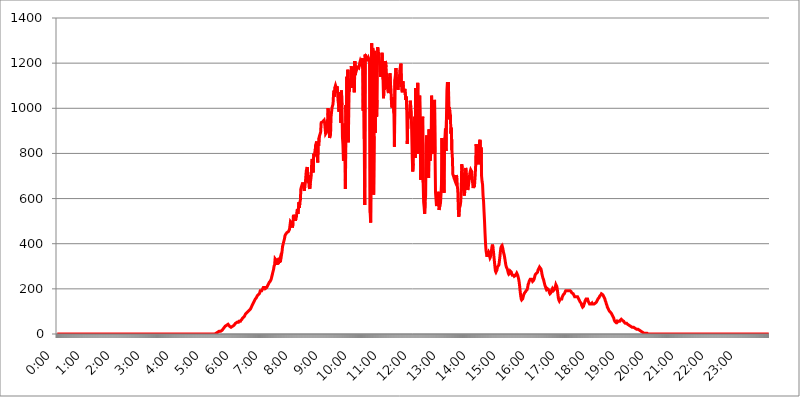
| Category | 2015.05.01. Intenzitás [W/m^2] |
|---|---|
| 0.0 | 0 |
| 0.0006944444444444445 | 0 |
| 0.001388888888888889 | 0 |
| 0.0020833333333333333 | 0 |
| 0.002777777777777778 | 0 |
| 0.003472222222222222 | 0 |
| 0.004166666666666667 | 0 |
| 0.004861111111111111 | 0 |
| 0.005555555555555556 | 0 |
| 0.0062499999999999995 | 0 |
| 0.006944444444444444 | 0 |
| 0.007638888888888889 | 0 |
| 0.008333333333333333 | 0 |
| 0.009027777777777779 | 0 |
| 0.009722222222222222 | 0 |
| 0.010416666666666666 | 0 |
| 0.011111111111111112 | 0 |
| 0.011805555555555555 | 0 |
| 0.012499999999999999 | 0 |
| 0.013194444444444444 | 0 |
| 0.013888888888888888 | 0 |
| 0.014583333333333332 | 0 |
| 0.015277777777777777 | 0 |
| 0.015972222222222224 | 0 |
| 0.016666666666666666 | 0 |
| 0.017361111111111112 | 0 |
| 0.018055555555555557 | 0 |
| 0.01875 | 0 |
| 0.019444444444444445 | 0 |
| 0.02013888888888889 | 0 |
| 0.020833333333333332 | 0 |
| 0.02152777777777778 | 0 |
| 0.022222222222222223 | 0 |
| 0.02291666666666667 | 0 |
| 0.02361111111111111 | 0 |
| 0.024305555555555556 | 0 |
| 0.024999999999999998 | 0 |
| 0.025694444444444447 | 0 |
| 0.02638888888888889 | 0 |
| 0.027083333333333334 | 0 |
| 0.027777777777777776 | 0 |
| 0.02847222222222222 | 0 |
| 0.029166666666666664 | 0 |
| 0.029861111111111113 | 0 |
| 0.030555555555555555 | 0 |
| 0.03125 | 0 |
| 0.03194444444444445 | 0 |
| 0.03263888888888889 | 0 |
| 0.03333333333333333 | 0 |
| 0.034027777777777775 | 0 |
| 0.034722222222222224 | 0 |
| 0.035416666666666666 | 0 |
| 0.036111111111111115 | 0 |
| 0.03680555555555556 | 0 |
| 0.0375 | 0 |
| 0.03819444444444444 | 0 |
| 0.03888888888888889 | 0 |
| 0.03958333333333333 | 0 |
| 0.04027777777777778 | 0 |
| 0.04097222222222222 | 0 |
| 0.041666666666666664 | 0 |
| 0.042361111111111106 | 0 |
| 0.04305555555555556 | 0 |
| 0.043750000000000004 | 0 |
| 0.044444444444444446 | 0 |
| 0.04513888888888889 | 0 |
| 0.04583333333333334 | 0 |
| 0.04652777777777778 | 0 |
| 0.04722222222222222 | 0 |
| 0.04791666666666666 | 0 |
| 0.04861111111111111 | 0 |
| 0.049305555555555554 | 0 |
| 0.049999999999999996 | 0 |
| 0.05069444444444445 | 0 |
| 0.051388888888888894 | 0 |
| 0.052083333333333336 | 0 |
| 0.05277777777777778 | 0 |
| 0.05347222222222222 | 0 |
| 0.05416666666666667 | 0 |
| 0.05486111111111111 | 0 |
| 0.05555555555555555 | 0 |
| 0.05625 | 0 |
| 0.05694444444444444 | 0 |
| 0.057638888888888885 | 0 |
| 0.05833333333333333 | 0 |
| 0.05902777777777778 | 0 |
| 0.059722222222222225 | 0 |
| 0.06041666666666667 | 0 |
| 0.061111111111111116 | 0 |
| 0.06180555555555556 | 0 |
| 0.0625 | 0 |
| 0.06319444444444444 | 0 |
| 0.06388888888888888 | 0 |
| 0.06458333333333334 | 0 |
| 0.06527777777777778 | 0 |
| 0.06597222222222222 | 0 |
| 0.06666666666666667 | 0 |
| 0.06736111111111111 | 0 |
| 0.06805555555555555 | 0 |
| 0.06874999999999999 | 0 |
| 0.06944444444444443 | 0 |
| 0.07013888888888889 | 0 |
| 0.07083333333333333 | 0 |
| 0.07152777777777779 | 0 |
| 0.07222222222222223 | 0 |
| 0.07291666666666667 | 0 |
| 0.07361111111111111 | 0 |
| 0.07430555555555556 | 0 |
| 0.075 | 0 |
| 0.07569444444444444 | 0 |
| 0.0763888888888889 | 0 |
| 0.07708333333333334 | 0 |
| 0.07777777777777778 | 0 |
| 0.07847222222222222 | 0 |
| 0.07916666666666666 | 0 |
| 0.0798611111111111 | 0 |
| 0.08055555555555556 | 0 |
| 0.08125 | 0 |
| 0.08194444444444444 | 0 |
| 0.08263888888888889 | 0 |
| 0.08333333333333333 | 0 |
| 0.08402777777777777 | 0 |
| 0.08472222222222221 | 0 |
| 0.08541666666666665 | 0 |
| 0.08611111111111112 | 0 |
| 0.08680555555555557 | 0 |
| 0.08750000000000001 | 0 |
| 0.08819444444444445 | 0 |
| 0.08888888888888889 | 0 |
| 0.08958333333333333 | 0 |
| 0.09027777777777778 | 0 |
| 0.09097222222222222 | 0 |
| 0.09166666666666667 | 0 |
| 0.09236111111111112 | 0 |
| 0.09305555555555556 | 0 |
| 0.09375 | 0 |
| 0.09444444444444444 | 0 |
| 0.09513888888888888 | 0 |
| 0.09583333333333333 | 0 |
| 0.09652777777777777 | 0 |
| 0.09722222222222222 | 0 |
| 0.09791666666666667 | 0 |
| 0.09861111111111111 | 0 |
| 0.09930555555555555 | 0 |
| 0.09999999999999999 | 0 |
| 0.10069444444444443 | 0 |
| 0.1013888888888889 | 0 |
| 0.10208333333333335 | 0 |
| 0.10277777777777779 | 0 |
| 0.10347222222222223 | 0 |
| 0.10416666666666667 | 0 |
| 0.10486111111111111 | 0 |
| 0.10555555555555556 | 0 |
| 0.10625 | 0 |
| 0.10694444444444444 | 0 |
| 0.1076388888888889 | 0 |
| 0.10833333333333334 | 0 |
| 0.10902777777777778 | 0 |
| 0.10972222222222222 | 0 |
| 0.1111111111111111 | 0 |
| 0.11180555555555556 | 0 |
| 0.11180555555555556 | 0 |
| 0.1125 | 0 |
| 0.11319444444444444 | 0 |
| 0.11388888888888889 | 0 |
| 0.11458333333333333 | 0 |
| 0.11527777777777777 | 0 |
| 0.11597222222222221 | 0 |
| 0.11666666666666665 | 0 |
| 0.1173611111111111 | 0 |
| 0.11805555555555557 | 0 |
| 0.11944444444444445 | 0 |
| 0.12013888888888889 | 0 |
| 0.12083333333333333 | 0 |
| 0.12152777777777778 | 0 |
| 0.12222222222222223 | 0 |
| 0.12291666666666667 | 0 |
| 0.12291666666666667 | 0 |
| 0.12361111111111112 | 0 |
| 0.12430555555555556 | 0 |
| 0.125 | 0 |
| 0.12569444444444444 | 0 |
| 0.12638888888888888 | 0 |
| 0.12708333333333333 | 0 |
| 0.16875 | 0 |
| 0.12847222222222224 | 0 |
| 0.12916666666666668 | 0 |
| 0.12986111111111112 | 0 |
| 0.13055555555555556 | 0 |
| 0.13125 | 0 |
| 0.13194444444444445 | 0 |
| 0.1326388888888889 | 0 |
| 0.13333333333333333 | 0 |
| 0.13402777777777777 | 0 |
| 0.13402777777777777 | 0 |
| 0.13472222222222222 | 0 |
| 0.13541666666666666 | 0 |
| 0.1361111111111111 | 0 |
| 0.13749999999999998 | 0 |
| 0.13819444444444443 | 0 |
| 0.1388888888888889 | 0 |
| 0.13958333333333334 | 0 |
| 0.14027777777777778 | 0 |
| 0.14097222222222222 | 0 |
| 0.14166666666666666 | 0 |
| 0.1423611111111111 | 0 |
| 0.14305555555555557 | 0 |
| 0.14375000000000002 | 0 |
| 0.14444444444444446 | 0 |
| 0.1451388888888889 | 0 |
| 0.1451388888888889 | 0 |
| 0.14652777777777778 | 0 |
| 0.14722222222222223 | 0 |
| 0.14791666666666667 | 0 |
| 0.1486111111111111 | 0 |
| 0.14930555555555555 | 0 |
| 0.15 | 0 |
| 0.15069444444444444 | 0 |
| 0.15138888888888888 | 0 |
| 0.15208333333333332 | 0 |
| 0.15277777777777776 | 0 |
| 0.15347222222222223 | 0 |
| 0.15416666666666667 | 0 |
| 0.15486111111111112 | 0 |
| 0.15555555555555556 | 0 |
| 0.15625 | 0 |
| 0.15694444444444444 | 0 |
| 0.15763888888888888 | 0 |
| 0.15833333333333333 | 0 |
| 0.15902777777777777 | 0 |
| 0.15972222222222224 | 0 |
| 0.16041666666666668 | 0 |
| 0.16111111111111112 | 0 |
| 0.16180555555555556 | 0 |
| 0.1625 | 0 |
| 0.16319444444444445 | 0 |
| 0.1638888888888889 | 0 |
| 0.16458333333333333 | 0 |
| 0.16527777777777777 | 0 |
| 0.16597222222222222 | 0 |
| 0.16666666666666666 | 0 |
| 0.1673611111111111 | 0 |
| 0.16805555555555554 | 0 |
| 0.16874999999999998 | 0 |
| 0.16944444444444443 | 0 |
| 0.17013888888888887 | 0 |
| 0.1708333333333333 | 0 |
| 0.17152777777777775 | 0 |
| 0.17222222222222225 | 0 |
| 0.1729166666666667 | 0 |
| 0.17361111111111113 | 0 |
| 0.17430555555555557 | 0 |
| 0.17500000000000002 | 0 |
| 0.17569444444444446 | 0 |
| 0.1763888888888889 | 0 |
| 0.17708333333333334 | 0 |
| 0.17777777777777778 | 0 |
| 0.17847222222222223 | 0 |
| 0.17916666666666667 | 0 |
| 0.1798611111111111 | 0 |
| 0.18055555555555555 | 0 |
| 0.18125 | 0 |
| 0.18194444444444444 | 0 |
| 0.1826388888888889 | 0 |
| 0.18333333333333335 | 0 |
| 0.1840277777777778 | 0 |
| 0.18472222222222223 | 0 |
| 0.18541666666666667 | 0 |
| 0.18611111111111112 | 0 |
| 0.18680555555555556 | 0 |
| 0.1875 | 0 |
| 0.18819444444444444 | 0 |
| 0.18888888888888888 | 0 |
| 0.18958333333333333 | 0 |
| 0.19027777777777777 | 0 |
| 0.1909722222222222 | 0 |
| 0.19166666666666665 | 0 |
| 0.19236111111111112 | 0 |
| 0.19305555555555554 | 0 |
| 0.19375 | 0 |
| 0.19444444444444445 | 0 |
| 0.1951388888888889 | 0 |
| 0.19583333333333333 | 0 |
| 0.19652777777777777 | 0 |
| 0.19722222222222222 | 0 |
| 0.19791666666666666 | 0 |
| 0.1986111111111111 | 0 |
| 0.19930555555555554 | 0 |
| 0.19999999999999998 | 0 |
| 0.20069444444444443 | 0 |
| 0.20138888888888887 | 0 |
| 0.2020833333333333 | 0 |
| 0.2027777777777778 | 0 |
| 0.2034722222222222 | 0 |
| 0.2041666666666667 | 0 |
| 0.20486111111111113 | 0 |
| 0.20555555555555557 | 0 |
| 0.20625000000000002 | 0 |
| 0.20694444444444446 | 0 |
| 0.2076388888888889 | 0 |
| 0.20833333333333334 | 0 |
| 0.20902777777777778 | 0 |
| 0.20972222222222223 | 0 |
| 0.21041666666666667 | 0 |
| 0.2111111111111111 | 0 |
| 0.21180555555555555 | 0 |
| 0.2125 | 0 |
| 0.21319444444444444 | 0 |
| 0.2138888888888889 | 0 |
| 0.21458333333333335 | 0 |
| 0.2152777777777778 | 0 |
| 0.21597222222222223 | 0 |
| 0.21666666666666667 | 0 |
| 0.21736111111111112 | 0 |
| 0.21805555555555556 | 0 |
| 0.21875 | 0 |
| 0.21944444444444444 | 0 |
| 0.22013888888888888 | 0 |
| 0.22083333333333333 | 0 |
| 0.22152777777777777 | 3.525 |
| 0.2222222222222222 | 3.525 |
| 0.22291666666666665 | 3.525 |
| 0.2236111111111111 | 3.525 |
| 0.22430555555555556 | 7.887 |
| 0.225 | 7.887 |
| 0.22569444444444445 | 7.887 |
| 0.2263888888888889 | 7.887 |
| 0.22708333333333333 | 12.257 |
| 0.22777777777777777 | 12.257 |
| 0.22847222222222222 | 12.257 |
| 0.22916666666666666 | 12.257 |
| 0.2298611111111111 | 16.636 |
| 0.23055555555555554 | 16.636 |
| 0.23124999999999998 | 16.636 |
| 0.23194444444444443 | 21.024 |
| 0.23263888888888887 | 21.024 |
| 0.2333333333333333 | 25.419 |
| 0.2340277777777778 | 25.419 |
| 0.2347222222222222 | 29.823 |
| 0.2354166666666667 | 34.234 |
| 0.23611111111111113 | 34.234 |
| 0.23680555555555557 | 38.653 |
| 0.23750000000000002 | 38.653 |
| 0.23819444444444446 | 38.653 |
| 0.2388888888888889 | 38.653 |
| 0.23958333333333334 | 43.079 |
| 0.24027777777777778 | 43.079 |
| 0.24097222222222223 | 38.653 |
| 0.24166666666666667 | 34.234 |
| 0.2423611111111111 | 29.823 |
| 0.24305555555555555 | 29.823 |
| 0.24375 | 29.823 |
| 0.24444444444444446 | 29.823 |
| 0.24513888888888888 | 34.234 |
| 0.24583333333333335 | 34.234 |
| 0.2465277777777778 | 38.653 |
| 0.24722222222222223 | 38.653 |
| 0.24791666666666667 | 38.653 |
| 0.24861111111111112 | 43.079 |
| 0.24930555555555556 | 43.079 |
| 0.25 | 47.511 |
| 0.25069444444444444 | 47.511 |
| 0.2513888888888889 | 47.511 |
| 0.2520833333333333 | 51.951 |
| 0.25277777777777777 | 51.951 |
| 0.2534722222222222 | 51.951 |
| 0.25416666666666665 | 51.951 |
| 0.2548611111111111 | 56.398 |
| 0.2555555555555556 | 56.398 |
| 0.25625000000000003 | 56.398 |
| 0.2569444444444445 | 56.398 |
| 0.2576388888888889 | 60.85 |
| 0.25833333333333336 | 60.85 |
| 0.2590277777777778 | 65.31 |
| 0.25972222222222224 | 69.775 |
| 0.2604166666666667 | 69.775 |
| 0.2611111111111111 | 74.246 |
| 0.26180555555555557 | 74.246 |
| 0.2625 | 78.722 |
| 0.26319444444444445 | 83.205 |
| 0.2638888888888889 | 87.692 |
| 0.26458333333333334 | 87.692 |
| 0.2652777777777778 | 92.184 |
| 0.2659722222222222 | 92.184 |
| 0.26666666666666666 | 96.682 |
| 0.2673611111111111 | 96.682 |
| 0.26805555555555555 | 101.184 |
| 0.26875 | 101.184 |
| 0.26944444444444443 | 105.69 |
| 0.2701388888888889 | 105.69 |
| 0.2708333333333333 | 110.201 |
| 0.27152777777777776 | 114.716 |
| 0.2722222222222222 | 119.235 |
| 0.27291666666666664 | 123.758 |
| 0.2736111111111111 | 128.284 |
| 0.2743055555555555 | 132.814 |
| 0.27499999999999997 | 137.347 |
| 0.27569444444444446 | 141.884 |
| 0.27638888888888885 | 146.423 |
| 0.27708333333333335 | 146.423 |
| 0.2777777777777778 | 155.509 |
| 0.27847222222222223 | 155.509 |
| 0.2791666666666667 | 160.056 |
| 0.2798611111111111 | 164.605 |
| 0.28055555555555556 | 169.156 |
| 0.28125 | 169.156 |
| 0.28194444444444444 | 173.709 |
| 0.2826388888888889 | 173.709 |
| 0.2833333333333333 | 178.264 |
| 0.28402777777777777 | 182.82 |
| 0.2847222222222222 | 191.937 |
| 0.28541666666666665 | 191.937 |
| 0.28611111111111115 | 191.937 |
| 0.28680555555555554 | 191.937 |
| 0.28750000000000003 | 196.497 |
| 0.2881944444444445 | 201.058 |
| 0.2888888888888889 | 205.62 |
| 0.28958333333333336 | 205.62 |
| 0.2902777777777778 | 205.62 |
| 0.29097222222222224 | 205.62 |
| 0.2916666666666667 | 201.058 |
| 0.2923611111111111 | 201.058 |
| 0.29305555555555557 | 201.058 |
| 0.29375 | 205.62 |
| 0.29444444444444445 | 210.182 |
| 0.2951388888888889 | 214.746 |
| 0.29583333333333334 | 219.309 |
| 0.2965277777777778 | 219.309 |
| 0.2972222222222222 | 228.436 |
| 0.29791666666666666 | 228.436 |
| 0.2986111111111111 | 233 |
| 0.29930555555555555 | 237.564 |
| 0.3 | 242.127 |
| 0.30069444444444443 | 251.251 |
| 0.3013888888888889 | 260.373 |
| 0.3020833333333333 | 269.49 |
| 0.30277777777777776 | 278.603 |
| 0.3034722222222222 | 287.709 |
| 0.30416666666666664 | 301.354 |
| 0.3048611111111111 | 305.898 |
| 0.3055555555555555 | 333.113 |
| 0.30624999999999997 | 333.113 |
| 0.3069444444444444 | 333.113 |
| 0.3076388888888889 | 324.052 |
| 0.30833333333333335 | 305.898 |
| 0.3090277777777778 | 333.113 |
| 0.30972222222222223 | 310.44 |
| 0.3104166666666667 | 319.517 |
| 0.3111111111111111 | 337.639 |
| 0.31180555555555556 | 314.98 |
| 0.3125 | 333.113 |
| 0.31319444444444444 | 342.162 |
| 0.3138888888888889 | 337.639 |
| 0.3145833333333333 | 351.198 |
| 0.31527777777777777 | 364.728 |
| 0.3159722222222222 | 387.202 |
| 0.31666666666666665 | 396.164 |
| 0.31736111111111115 | 405.108 |
| 0.31805555555555554 | 414.035 |
| 0.31875000000000003 | 422.943 |
| 0.3194444444444445 | 436.27 |
| 0.3201388888888889 | 440.702 |
| 0.32083333333333336 | 445.129 |
| 0.3215277777777778 | 445.129 |
| 0.32222222222222224 | 449.551 |
| 0.3229166666666667 | 453.968 |
| 0.3236111111111111 | 449.551 |
| 0.32430555555555557 | 453.968 |
| 0.325 | 458.38 |
| 0.32569444444444445 | 462.786 |
| 0.3263888888888889 | 467.187 |
| 0.32708333333333334 | 497.836 |
| 0.3277777777777778 | 493.475 |
| 0.3284722222222222 | 502.192 |
| 0.32916666666666666 | 489.108 |
| 0.3298611111111111 | 471.582 |
| 0.33055555555555555 | 489.108 |
| 0.33125 | 528.2 |
| 0.33194444444444443 | 510.885 |
| 0.3326388888888889 | 523.88 |
| 0.3333333333333333 | 519.555 |
| 0.3340277777777778 | 502.192 |
| 0.3347222222222222 | 510.885 |
| 0.3354166666666667 | 519.555 |
| 0.3361111111111111 | 541.121 |
| 0.3368055555555556 | 553.986 |
| 0.33749999999999997 | 532.513 |
| 0.33819444444444446 | 553.986 |
| 0.33888888888888885 | 583.779 |
| 0.33958333333333335 | 558.261 |
| 0.34027777777777773 | 583.779 |
| 0.34097222222222223 | 592.233 |
| 0.3416666666666666 | 642.4 |
| 0.3423611111111111 | 642.4 |
| 0.3430555555555555 | 658.909 |
| 0.34375 | 658.909 |
| 0.3444444444444445 | 671.22 |
| 0.3451388888888889 | 658.909 |
| 0.3458333333333334 | 642.4 |
| 0.34652777777777777 | 634.105 |
| 0.34722222222222227 | 654.791 |
| 0.34791666666666665 | 667.123 |
| 0.34861111111111115 | 671.22 |
| 0.34930555555555554 | 723.889 |
| 0.35000000000000003 | 719.877 |
| 0.3506944444444444 | 739.877 |
| 0.3513888888888889 | 735.89 |
| 0.3520833333333333 | 671.22 |
| 0.3527777777777778 | 703.762 |
| 0.3534722222222222 | 650.667 |
| 0.3541666666666667 | 642.4 |
| 0.3548611111111111 | 667.123 |
| 0.35555555555555557 | 683.473 |
| 0.35625 | 703.762 |
| 0.35694444444444445 | 763.674 |
| 0.3576388888888889 | 775.492 |
| 0.35833333333333334 | 751.803 |
| 0.3590277777777778 | 715.858 |
| 0.3597222222222222 | 798.974 |
| 0.36041666666666666 | 798.974 |
| 0.3611111111111111 | 787.258 |
| 0.36180555555555555 | 791.169 |
| 0.3625 | 837.682 |
| 0.36319444444444443 | 845.365 |
| 0.3638888888888889 | 853.029 |
| 0.3645833333333333 | 806.757 |
| 0.3652777777777778 | 759.723 |
| 0.3659722222222222 | 849.199 |
| 0.3666666666666667 | 833.834 |
| 0.3673611111111111 | 872.114 |
| 0.3680555555555556 | 875.918 |
| 0.36874999999999997 | 875.918 |
| 0.36944444444444446 | 894.885 |
| 0.37013888888888885 | 936.33 |
| 0.37083333333333335 | 936.33 |
| 0.37152777777777773 | 940.082 |
| 0.37222222222222223 | 940.082 |
| 0.3729166666666666 | 940.082 |
| 0.3736111111111111 | 940.082 |
| 0.3743055555555555 | 947.58 |
| 0.375 | 936.33 |
| 0.3756944444444445 | 936.33 |
| 0.3763888888888889 | 887.309 |
| 0.3770833333333334 | 887.309 |
| 0.37777777777777777 | 894.885 |
| 0.37847222222222227 | 894.885 |
| 0.37916666666666665 | 947.58 |
| 0.37986111111111115 | 999.916 |
| 0.38055555555555554 | 947.58 |
| 0.38125000000000003 | 906.223 |
| 0.3819444444444444 | 868.305 |
| 0.3826388888888889 | 864.493 |
| 0.3833333333333333 | 887.309 |
| 0.3840277777777778 | 962.555 |
| 0.3847222222222222 | 958.814 |
| 0.3854166666666667 | 1003.65 |
| 0.3861111111111111 | 999.916 |
| 0.38680555555555557 | 1018.587 |
| 0.3875 | 1063.51 |
| 0.38819444444444445 | 1078.555 |
| 0.3888888888888889 | 1052.255 |
| 0.38958333333333334 | 1093.653 |
| 0.3902777777777778 | 1101.226 |
| 0.3909722222222222 | 1105.019 |
| 0.39166666666666666 | 1086.097 |
| 0.3923611111111111 | 1097.437 |
| 0.39305555555555555 | 1078.555 |
| 0.39375 | 1037.277 |
| 0.39444444444444443 | 1018.587 |
| 0.3951388888888889 | 984.98 |
| 0.3958333333333333 | 1063.51 |
| 0.3965277777777778 | 1052.255 |
| 0.3972222222222222 | 1071.027 |
| 0.3979166666666667 | 936.33 |
| 0.3986111111111111 | 1078.555 |
| 0.3993055555555556 | 1014.852 |
| 0.39999999999999997 | 872.114 |
| 0.40069444444444446 | 837.682 |
| 0.40138888888888885 | 767.62 |
| 0.40208333333333335 | 810.641 |
| 0.40277777777777773 | 783.342 |
| 0.40347222222222223 | 932.576 |
| 0.4041666666666666 | 642.4 |
| 0.4048611111111111 | 1014.852 |
| 0.4055555555555555 | 940.082 |
| 0.40625 | 1139.384 |
| 0.4069444444444445 | 1022.323 |
| 0.4076388888888889 | 1170.358 |
| 0.4083333333333334 | 849.199 |
| 0.40902777777777777 | 1112.618 |
| 0.40972222222222227 | 1074.789 |
| 0.41041666666666665 | 1124.056 |
| 0.41111111111111115 | 1093.653 |
| 0.41180555555555554 | 1131.708 |
| 0.41250000000000003 | 1186.03 |
| 0.4131944444444444 | 1089.873 |
| 0.4138888888888889 | 1158.689 |
| 0.4145833333333333 | 1174.263 |
| 0.4152777777777778 | 1154.814 |
| 0.4159722222222222 | 1174.263 |
| 0.4166666666666667 | 1071.027 |
| 0.4173611111111111 | 1209.807 |
| 0.41805555555555557 | 1147.086 |
| 0.41875 | 1186.03 |
| 0.41944444444444445 | 1182.099 |
| 0.4201388888888889 | 1174.263 |
| 0.42083333333333334 | 1182.099 |
| 0.4215277777777778 | 1178.177 |
| 0.4222222222222222 | 1186.03 |
| 0.42291666666666666 | 1178.177 |
| 0.4236111111111111 | 1178.177 |
| 0.42430555555555555 | 1201.843 |
| 0.425 | 1209.807 |
| 0.42569444444444443 | 1205.82 |
| 0.4263888888888889 | 1197.876 |
| 0.4270833333333333 | 1209.807 |
| 0.4277777777777778 | 1209.807 |
| 0.4284722222222222 | 1221.83 |
| 0.4291666666666667 | 988.714 |
| 0.4298611111111111 | 1217.812 |
| 0.4305555555555556 | 864.493 |
| 0.43124999999999997 | 571.049 |
| 0.43194444444444446 | 1238.014 |
| 0.43263888888888885 | 1209.807 |
| 0.43333333333333335 | 1225.859 |
| 0.43402777777777773 | 1221.83 |
| 0.43472222222222223 | 1217.812 |
| 0.4354166666666666 | 1213.804 |
| 0.4361111111111111 | 1225.859 |
| 0.4368055555555555 | 1221.83 |
| 0.4375 | 1213.804 |
| 0.4381944444444445 | 1221.83 |
| 0.4388888888888889 | 536.82 |
| 0.4395833333333334 | 493.475 |
| 0.44027777777777777 | 887.309 |
| 0.44097222222222227 | 1287.761 |
| 0.44166666666666665 | 810.641 |
| 0.44236111111111115 | 1266.8 |
| 0.44305555555555554 | 1254.387 |
| 0.44375000000000003 | 617.436 |
| 0.4444444444444444 | 875.918 |
| 0.4451388888888889 | 1254.387 |
| 0.4458333333333333 | 891.099 |
| 0.4465277777777778 | 1233.951 |
| 0.4472222222222222 | 1233.951 |
| 0.4479166666666667 | 962.555 |
| 0.4486111111111111 | 1037.277 |
| 0.44930555555555557 | 1270.964 |
| 0.45 | 1258.511 |
| 0.45069444444444445 | 1242.089 |
| 0.4513888888888889 | 1201.843 |
| 0.45208333333333334 | 1209.807 |
| 0.4527777777777778 | 1193.918 |
| 0.4534722222222222 | 1139.384 |
| 0.45416666666666666 | 1158.689 |
| 0.4548611111111111 | 1189.969 |
| 0.45555555555555555 | 1246.176 |
| 0.45625 | 1242.089 |
| 0.45694444444444443 | 1127.879 |
| 0.4576388888888889 | 1044.762 |
| 0.4583333333333333 | 1112.618 |
| 0.4590277777777778 | 1082.324 |
| 0.4597222222222222 | 1143.232 |
| 0.4604166666666667 | 1209.807 |
| 0.4611111111111111 | 1182.099 |
| 0.4618055555555556 | 1147.086 |
| 0.46249999999999997 | 1116.426 |
| 0.46319444444444446 | 1089.873 |
| 0.46388888888888885 | 1074.789 |
| 0.46458333333333335 | 1067.267 |
| 0.46527777777777773 | 1112.618 |
| 0.46597222222222223 | 1108.816 |
| 0.4666666666666666 | 1154.814 |
| 0.4673611111111111 | 1108.816 |
| 0.4680555555555555 | 1082.324 |
| 0.46875 | 1026.06 |
| 0.4694444444444445 | 1003.65 |
| 0.4701388888888889 | 1048.508 |
| 0.4708333333333334 | 1003.65 |
| 0.47152777777777777 | 1014.852 |
| 0.47222222222222227 | 977.508 |
| 0.47291666666666665 | 829.981 |
| 0.47361111111111115 | 1127.879 |
| 0.47430555555555554 | 1147.086 |
| 0.47500000000000003 | 1178.177 |
| 0.4756944444444444 | 1135.543 |
| 0.4763888888888889 | 1108.816 |
| 0.4770833333333333 | 1127.879 |
| 0.4777777777777778 | 1082.324 |
| 0.4784722222222222 | 1108.816 |
| 0.4791666666666667 | 1116.426 |
| 0.4798611111111111 | 1131.708 |
| 0.48055555555555557 | 1170.358 |
| 0.48125 | 1174.263 |
| 0.48194444444444445 | 1197.876 |
| 0.4826388888888889 | 1112.618 |
| 0.48333333333333334 | 1078.555 |
| 0.4840277777777778 | 1071.027 |
| 0.4847222222222222 | 1120.238 |
| 0.48541666666666666 | 1089.873 |
| 0.4861111111111111 | 1071.027 |
| 0.48680555555555555 | 1074.789 |
| 0.4875 | 1086.097 |
| 0.48819444444444443 | 1082.324 |
| 0.4888888888888889 | 1037.277 |
| 0.4895833333333333 | 1052.255 |
| 0.4902777777777778 | 992.448 |
| 0.4909722222222222 | 841.526 |
| 0.4916666666666667 | 947.58 |
| 0.4923611111111111 | 955.071 |
| 0.4930555555555556 | 951.327 |
| 0.49374999999999997 | 955.071 |
| 0.49444444444444446 | 988.714 |
| 0.49513888888888885 | 1033.537 |
| 0.49583333333333335 | 1003.65 |
| 0.49652777777777773 | 984.98 |
| 0.49722222222222223 | 984.98 |
| 0.4979166666666666 | 779.42 |
| 0.4986111111111111 | 719.877 |
| 0.4993055555555555 | 755.766 |
| 0.5 | 894.885 |
| 0.5006944444444444 | 845.365 |
| 0.5013888888888889 | 962.555 |
| 0.5020833333333333 | 779.42 |
| 0.5027777777777778 | 1089.873 |
| 0.5034722222222222 | 802.868 |
| 0.5041666666666667 | 837.682 |
| 0.5048611111111111 | 829.981 |
| 0.5055555555555555 | 1112.618 |
| 0.50625 | 798.974 |
| 0.5069444444444444 | 826.123 |
| 0.5076388888888889 | 1003.65 |
| 0.5083333333333333 | 1056.004 |
| 0.5090277777777777 | 917.534 |
| 0.5097222222222222 | 683.473 |
| 0.5104166666666666 | 731.896 |
| 0.5111111111111112 | 894.885 |
| 0.5118055555555555 | 883.516 |
| 0.5125000000000001 | 962.555 |
| 0.5131944444444444 | 671.22 |
| 0.513888888888889 | 583.779 |
| 0.5145833333333333 | 562.53 |
| 0.5152777777777778 | 532.513 |
| 0.5159722222222222 | 583.779 |
| 0.5166666666666667 | 613.252 |
| 0.517361111111111 | 833.834 |
| 0.5180555555555556 | 879.719 |
| 0.5187499999999999 | 795.074 |
| 0.5194444444444445 | 853.029 |
| 0.5201388888888888 | 833.834 |
| 0.5208333333333334 | 691.608 |
| 0.5215277777777778 | 906.223 |
| 0.5222222222222223 | 849.199 |
| 0.5229166666666667 | 767.62 |
| 0.5236111111111111 | 791.169 |
| 0.5243055555555556 | 806.757 |
| 0.525 | 1056.004 |
| 0.5256944444444445 | 909.996 |
| 0.5263888888888889 | 798.974 |
| 0.5270833333333333 | 841.526 |
| 0.5277777777777778 | 814.519 |
| 0.5284722222222222 | 917.534 |
| 0.5291666666666667 | 1037.277 |
| 0.5298611111111111 | 802.868 |
| 0.5305555555555556 | 625.784 |
| 0.53125 | 596.45 |
| 0.5319444444444444 | 566.793 |
| 0.5326388888888889 | 562.53 |
| 0.5333333333333333 | 571.049 |
| 0.5340277777777778 | 629.948 |
| 0.5347222222222222 | 617.436 |
| 0.5354166666666667 | 549.704 |
| 0.5361111111111111 | 549.704 |
| 0.5368055555555555 | 571.049 |
| 0.5375 | 579.542 |
| 0.5381944444444444 | 617.436 |
| 0.5388888888888889 | 663.019 |
| 0.5395833333333333 | 868.305 |
| 0.5402777777777777 | 679.395 |
| 0.5409722222222222 | 667.123 |
| 0.5416666666666666 | 715.858 |
| 0.5423611111111112 | 625.784 |
| 0.5430555555555555 | 845.365 |
| 0.5437500000000001 | 868.305 |
| 0.5444444444444444 | 909.996 |
| 0.545138888888889 | 810.641 |
| 0.5458333333333333 | 947.58 |
| 0.5465277777777778 | 1078.555 |
| 0.5472222222222222 | 1116.426 |
| 0.5479166666666667 | 1041.019 |
| 0.548611111111111 | 1116.426 |
| 0.5493055555555556 | 951.327 |
| 0.5499999999999999 | 1003.65 |
| 0.5506944444444445 | 981.244 |
| 0.5513888888888888 | 970.034 |
| 0.5520833333333334 | 887.309 |
| 0.5527777777777778 | 913.766 |
| 0.5534722222222223 | 814.519 |
| 0.5541666666666667 | 783.342 |
| 0.5548611111111111 | 707.8 |
| 0.5555555555555556 | 703.762 |
| 0.55625 | 703.762 |
| 0.5569444444444445 | 687.544 |
| 0.5576388888888889 | 687.544 |
| 0.5583333333333333 | 675.311 |
| 0.5590277777777778 | 683.473 |
| 0.5597222222222222 | 703.762 |
| 0.5604166666666667 | 695.666 |
| 0.5611111111111111 | 654.791 |
| 0.5618055555555556 | 638.256 |
| 0.5625 | 553.986 |
| 0.5631944444444444 | 519.555 |
| 0.5638888888888889 | 553.986 |
| 0.5645833333333333 | 558.261 |
| 0.5652777777777778 | 571.049 |
| 0.5659722222222222 | 588.009 |
| 0.5666666666666667 | 650.667 |
| 0.5673611111111111 | 751.803 |
| 0.5680555555555555 | 719.877 |
| 0.56875 | 703.762 |
| 0.5694444444444444 | 663.019 |
| 0.5701388888888889 | 625.784 |
| 0.5708333333333333 | 613.252 |
| 0.5715277777777777 | 629.948 |
| 0.5722222222222222 | 683.473 |
| 0.5729166666666666 | 735.89 |
| 0.5736111111111112 | 731.896 |
| 0.5743055555555555 | 679.395 |
| 0.5750000000000001 | 646.537 |
| 0.5756944444444444 | 638.256 |
| 0.576388888888889 | 646.537 |
| 0.5770833333333333 | 667.123 |
| 0.5777777777777778 | 683.473 |
| 0.5784722222222222 | 707.8 |
| 0.5791666666666667 | 719.877 |
| 0.579861111111111 | 727.896 |
| 0.5805555555555556 | 727.896 |
| 0.5812499999999999 | 719.877 |
| 0.5819444444444445 | 695.666 |
| 0.5826388888888888 | 667.123 |
| 0.5833333333333334 | 646.537 |
| 0.5840277777777778 | 658.909 |
| 0.5847222222222223 | 650.667 |
| 0.5854166666666667 | 667.123 |
| 0.5861111111111111 | 699.717 |
| 0.5868055555555556 | 743.859 |
| 0.5875 | 841.526 |
| 0.5881944444444445 | 826.123 |
| 0.5888888888888889 | 818.392 |
| 0.5895833333333333 | 763.674 |
| 0.5902777777777778 | 791.169 |
| 0.5909722222222222 | 751.803 |
| 0.5916666666666667 | 751.803 |
| 0.5923611111111111 | 853.029 |
| 0.5930555555555556 | 860.676 |
| 0.59375 | 771.559 |
| 0.5944444444444444 | 826.123 |
| 0.5951388888888889 | 699.717 |
| 0.5958333333333333 | 675.311 |
| 0.5965277777777778 | 663.019 |
| 0.5972222222222222 | 613.252 |
| 0.5979166666666667 | 588.009 |
| 0.5986111111111111 | 541.121 |
| 0.5993055555555555 | 497.836 |
| 0.6 | 445.129 |
| 0.6006944444444444 | 400.638 |
| 0.6013888888888889 | 369.23 |
| 0.6020833333333333 | 355.712 |
| 0.6027777777777777 | 342.162 |
| 0.6034722222222222 | 342.162 |
| 0.6041666666666666 | 360.221 |
| 0.6048611111111112 | 364.728 |
| 0.6055555555555555 | 360.221 |
| 0.6062500000000001 | 346.682 |
| 0.6069444444444444 | 337.639 |
| 0.607638888888889 | 342.162 |
| 0.6083333333333333 | 355.712 |
| 0.6090277777777778 | 369.23 |
| 0.6097222222222222 | 387.202 |
| 0.6104166666666667 | 396.164 |
| 0.611111111111111 | 382.715 |
| 0.6118055555555556 | 364.728 |
| 0.6124999999999999 | 342.162 |
| 0.6131944444444445 | 319.517 |
| 0.6138888888888888 | 296.808 |
| 0.6145833333333334 | 278.603 |
| 0.6152777777777778 | 274.047 |
| 0.6159722222222223 | 278.603 |
| 0.6166666666666667 | 283.156 |
| 0.6173611111111111 | 296.808 |
| 0.6180555555555556 | 296.808 |
| 0.61875 | 296.808 |
| 0.6194444444444445 | 305.898 |
| 0.6201388888888889 | 324.052 |
| 0.6208333333333333 | 342.162 |
| 0.6215277777777778 | 364.728 |
| 0.6222222222222222 | 382.715 |
| 0.6229166666666667 | 387.202 |
| 0.6236111111111111 | 382.715 |
| 0.6243055555555556 | 387.202 |
| 0.625 | 378.224 |
| 0.6256944444444444 | 364.728 |
| 0.6263888888888889 | 355.712 |
| 0.6270833333333333 | 346.682 |
| 0.6277777777777778 | 333.113 |
| 0.6284722222222222 | 319.517 |
| 0.6291666666666667 | 305.898 |
| 0.6298611111111111 | 296.808 |
| 0.6305555555555555 | 296.808 |
| 0.63125 | 287.709 |
| 0.6319444444444444 | 278.603 |
| 0.6326388888888889 | 269.49 |
| 0.6333333333333333 | 264.932 |
| 0.6340277777777777 | 264.932 |
| 0.6347222222222222 | 269.49 |
| 0.6354166666666666 | 278.603 |
| 0.6361111111111112 | 278.603 |
| 0.6368055555555555 | 274.047 |
| 0.6375000000000001 | 264.932 |
| 0.6381944444444444 | 260.373 |
| 0.638888888888889 | 260.373 |
| 0.6395833333333333 | 260.373 |
| 0.6402777777777778 | 260.373 |
| 0.6409722222222222 | 255.813 |
| 0.6416666666666667 | 255.813 |
| 0.642361111111111 | 255.813 |
| 0.6430555555555556 | 260.373 |
| 0.6437499999999999 | 260.373 |
| 0.6444444444444445 | 269.49 |
| 0.6451388888888888 | 269.49 |
| 0.6458333333333334 | 260.373 |
| 0.6465277777777778 | 251.251 |
| 0.6472222222222223 | 242.127 |
| 0.6479166666666667 | 228.436 |
| 0.6486111111111111 | 210.182 |
| 0.6493055555555556 | 187.378 |
| 0.65 | 169.156 |
| 0.6506944444444445 | 155.509 |
| 0.6513888888888889 | 150.964 |
| 0.6520833333333333 | 150.964 |
| 0.6527777777777778 | 155.509 |
| 0.6534722222222222 | 164.605 |
| 0.6541666666666667 | 173.709 |
| 0.6548611111111111 | 178.264 |
| 0.6555555555555556 | 182.82 |
| 0.65625 | 182.82 |
| 0.6569444444444444 | 187.378 |
| 0.6576388888888889 | 191.937 |
| 0.6583333333333333 | 191.937 |
| 0.6590277777777778 | 196.497 |
| 0.6597222222222222 | 205.62 |
| 0.6604166666666667 | 219.309 |
| 0.6611111111111111 | 223.873 |
| 0.6618055555555555 | 233 |
| 0.6625 | 237.564 |
| 0.6631944444444444 | 242.127 |
| 0.6638888888888889 | 242.127 |
| 0.6645833333333333 | 242.127 |
| 0.6652777777777777 | 242.127 |
| 0.6659722222222222 | 237.564 |
| 0.6666666666666666 | 233 |
| 0.6673611111111111 | 233 |
| 0.6680555555555556 | 237.564 |
| 0.6687500000000001 | 242.127 |
| 0.6694444444444444 | 251.251 |
| 0.6701388888888888 | 260.373 |
| 0.6708333333333334 | 264.932 |
| 0.6715277777777778 | 264.932 |
| 0.6722222222222222 | 269.49 |
| 0.6729166666666666 | 269.49 |
| 0.6736111111111112 | 274.047 |
| 0.6743055555555556 | 283.156 |
| 0.6749999999999999 | 287.709 |
| 0.6756944444444444 | 292.259 |
| 0.6763888888888889 | 296.808 |
| 0.6770833333333334 | 296.808 |
| 0.6777777777777777 | 296.808 |
| 0.6784722222222223 | 287.709 |
| 0.6791666666666667 | 278.603 |
| 0.6798611111111111 | 264.932 |
| 0.6805555555555555 | 255.813 |
| 0.68125 | 246.689 |
| 0.6819444444444445 | 242.127 |
| 0.6826388888888889 | 233 |
| 0.6833333333333332 | 223.873 |
| 0.6840277777777778 | 214.746 |
| 0.6847222222222222 | 210.182 |
| 0.6854166666666667 | 201.058 |
| 0.686111111111111 | 196.497 |
| 0.6868055555555556 | 196.497 |
| 0.6875 | 201.058 |
| 0.6881944444444444 | 201.058 |
| 0.688888888888889 | 196.497 |
| 0.6895833333333333 | 191.937 |
| 0.6902777777777778 | 182.82 |
| 0.6909722222222222 | 178.264 |
| 0.6916666666666668 | 178.264 |
| 0.6923611111111111 | 182.82 |
| 0.6930555555555555 | 191.937 |
| 0.69375 | 196.497 |
| 0.6944444444444445 | 201.058 |
| 0.6951388888888889 | 196.497 |
| 0.6958333333333333 | 191.937 |
| 0.6965277777777777 | 191.937 |
| 0.6972222222222223 | 196.497 |
| 0.6979166666666666 | 205.62 |
| 0.6986111111111111 | 210.182 |
| 0.6993055555555556 | 219.309 |
| 0.7000000000000001 | 219.309 |
| 0.7006944444444444 | 210.182 |
| 0.7013888888888888 | 196.497 |
| 0.7020833333333334 | 178.264 |
| 0.7027777777777778 | 160.056 |
| 0.7034722222222222 | 150.964 |
| 0.7041666666666666 | 146.423 |
| 0.7048611111111112 | 150.964 |
| 0.7055555555555556 | 155.509 |
| 0.7062499999999999 | 155.509 |
| 0.7069444444444444 | 155.509 |
| 0.7076388888888889 | 155.509 |
| 0.7083333333333334 | 164.605 |
| 0.7090277777777777 | 169.156 |
| 0.7097222222222223 | 173.709 |
| 0.7104166666666667 | 173.709 |
| 0.7111111111111111 | 178.264 |
| 0.7118055555555555 | 182.82 |
| 0.7125 | 187.378 |
| 0.7131944444444445 | 191.937 |
| 0.7138888888888889 | 191.937 |
| 0.7145833333333332 | 191.937 |
| 0.7152777777777778 | 191.937 |
| 0.7159722222222222 | 191.937 |
| 0.7166666666666667 | 191.937 |
| 0.717361111111111 | 191.937 |
| 0.7180555555555556 | 191.937 |
| 0.71875 | 191.937 |
| 0.7194444444444444 | 191.937 |
| 0.720138888888889 | 191.937 |
| 0.7208333333333333 | 187.378 |
| 0.7215277777777778 | 182.82 |
| 0.7222222222222222 | 182.82 |
| 0.7229166666666668 | 182.82 |
| 0.7236111111111111 | 178.264 |
| 0.7243055555555555 | 173.709 |
| 0.725 | 169.156 |
| 0.7256944444444445 | 164.605 |
| 0.7263888888888889 | 164.605 |
| 0.7270833333333333 | 164.605 |
| 0.7277777777777777 | 164.605 |
| 0.7284722222222223 | 164.605 |
| 0.7291666666666666 | 164.605 |
| 0.7298611111111111 | 164.605 |
| 0.7305555555555556 | 164.605 |
| 0.7312500000000001 | 155.509 |
| 0.7319444444444444 | 150.964 |
| 0.7326388888888888 | 146.423 |
| 0.7333333333333334 | 141.884 |
| 0.7340277777777778 | 141.884 |
| 0.7347222222222222 | 137.347 |
| 0.7354166666666666 | 128.284 |
| 0.7361111111111112 | 123.758 |
| 0.7368055555555556 | 119.235 |
| 0.7374999999999999 | 119.235 |
| 0.7381944444444444 | 123.758 |
| 0.7388888888888889 | 132.814 |
| 0.7395833333333334 | 137.347 |
| 0.7402777777777777 | 146.423 |
| 0.7409722222222223 | 150.964 |
| 0.7416666666666667 | 155.509 |
| 0.7423611111111111 | 155.509 |
| 0.7430555555555555 | 155.509 |
| 0.74375 | 155.509 |
| 0.7444444444444445 | 146.423 |
| 0.7451388888888889 | 141.884 |
| 0.7458333333333332 | 137.347 |
| 0.7465277777777778 | 132.814 |
| 0.7472222222222222 | 132.814 |
| 0.7479166666666667 | 132.814 |
| 0.748611111111111 | 132.814 |
| 0.7493055555555556 | 132.814 |
| 0.75 | 137.347 |
| 0.7506944444444444 | 132.814 |
| 0.751388888888889 | 132.814 |
| 0.7520833333333333 | 132.814 |
| 0.7527777777777778 | 132.814 |
| 0.7534722222222222 | 132.814 |
| 0.7541666666666668 | 132.814 |
| 0.7548611111111111 | 137.347 |
| 0.7555555555555555 | 137.347 |
| 0.75625 | 141.884 |
| 0.7569444444444445 | 146.423 |
| 0.7576388888888889 | 150.964 |
| 0.7583333333333333 | 155.509 |
| 0.7590277777777777 | 155.509 |
| 0.7597222222222223 | 160.056 |
| 0.7604166666666666 | 164.605 |
| 0.7611111111111111 | 169.156 |
| 0.7618055555555556 | 169.156 |
| 0.7625000000000001 | 173.709 |
| 0.7631944444444444 | 178.264 |
| 0.7638888888888888 | 178.264 |
| 0.7645833333333334 | 178.264 |
| 0.7652777777777778 | 173.709 |
| 0.7659722222222222 | 169.156 |
| 0.7666666666666666 | 164.605 |
| 0.7673611111111112 | 164.605 |
| 0.7680555555555556 | 155.509 |
| 0.7687499999999999 | 146.423 |
| 0.7694444444444444 | 141.884 |
| 0.7701388888888889 | 132.814 |
| 0.7708333333333334 | 128.284 |
| 0.7715277777777777 | 119.235 |
| 0.7722222222222223 | 114.716 |
| 0.7729166666666667 | 110.201 |
| 0.7736111111111111 | 105.69 |
| 0.7743055555555555 | 101.184 |
| 0.775 | 101.184 |
| 0.7756944444444445 | 96.682 |
| 0.7763888888888889 | 96.682 |
| 0.7770833333333332 | 92.184 |
| 0.7777777777777778 | 87.692 |
| 0.7784722222222222 | 83.205 |
| 0.7791666666666667 | 78.722 |
| 0.779861111111111 | 74.246 |
| 0.7805555555555556 | 69.775 |
| 0.78125 | 60.85 |
| 0.7819444444444444 | 56.398 |
| 0.782638888888889 | 56.398 |
| 0.7833333333333333 | 51.951 |
| 0.7840277777777778 | 51.951 |
| 0.7847222222222222 | 56.398 |
| 0.7854166666666668 | 51.951 |
| 0.7861111111111111 | 51.951 |
| 0.7868055555555555 | 56.398 |
| 0.7875 | 56.398 |
| 0.7881944444444445 | 56.398 |
| 0.7888888888888889 | 56.398 |
| 0.7895833333333333 | 60.85 |
| 0.7902777777777777 | 60.85 |
| 0.7909722222222223 | 65.31 |
| 0.7916666666666666 | 65.31 |
| 0.7923611111111111 | 60.85 |
| 0.7930555555555556 | 60.85 |
| 0.7937500000000001 | 60.85 |
| 0.7944444444444444 | 56.398 |
| 0.7951388888888888 | 51.951 |
| 0.7958333333333334 | 51.951 |
| 0.7965277777777778 | 47.511 |
| 0.7972222222222222 | 47.511 |
| 0.7979166666666666 | 47.511 |
| 0.7986111111111112 | 47.511 |
| 0.7993055555555556 | 47.511 |
| 0.7999999999999999 | 43.079 |
| 0.8006944444444444 | 43.079 |
| 0.8013888888888889 | 43.079 |
| 0.8020833333333334 | 38.653 |
| 0.8027777777777777 | 38.653 |
| 0.8034722222222223 | 38.653 |
| 0.8041666666666667 | 34.234 |
| 0.8048611111111111 | 34.234 |
| 0.8055555555555555 | 34.234 |
| 0.80625 | 29.823 |
| 0.8069444444444445 | 29.823 |
| 0.8076388888888889 | 29.823 |
| 0.8083333333333332 | 29.823 |
| 0.8090277777777778 | 25.419 |
| 0.8097222222222222 | 25.419 |
| 0.8104166666666667 | 25.419 |
| 0.811111111111111 | 21.024 |
| 0.8118055555555556 | 21.024 |
| 0.8125 | 21.024 |
| 0.8131944444444444 | 21.024 |
| 0.813888888888889 | 21.024 |
| 0.8145833333333333 | 21.024 |
| 0.8152777777777778 | 16.636 |
| 0.8159722222222222 | 16.636 |
| 0.8166666666666668 | 16.636 |
| 0.8173611111111111 | 12.257 |
| 0.8180555555555555 | 12.257 |
| 0.81875 | 12.257 |
| 0.8194444444444445 | 7.887 |
| 0.8201388888888889 | 7.887 |
| 0.8208333333333333 | 7.887 |
| 0.8215277777777777 | 7.887 |
| 0.8222222222222223 | 7.887 |
| 0.8229166666666666 | 3.525 |
| 0.8236111111111111 | 3.525 |
| 0.8243055555555556 | 3.525 |
| 0.8250000000000001 | 3.525 |
| 0.8256944444444444 | 3.525 |
| 0.8263888888888888 | 3.525 |
| 0.8270833333333334 | 3.525 |
| 0.8277777777777778 | 0 |
| 0.8284722222222222 | 0 |
| 0.8291666666666666 | 0 |
| 0.8298611111111112 | 0 |
| 0.8305555555555556 | 0 |
| 0.8312499999999999 | 0 |
| 0.8319444444444444 | 0 |
| 0.8326388888888889 | 0 |
| 0.8333333333333334 | 0 |
| 0.8340277777777777 | 0 |
| 0.8347222222222223 | 0 |
| 0.8354166666666667 | 0 |
| 0.8361111111111111 | 0 |
| 0.8368055555555555 | 0 |
| 0.8375 | 0 |
| 0.8381944444444445 | 0 |
| 0.8388888888888889 | 0 |
| 0.8395833333333332 | 0 |
| 0.8402777777777778 | 0 |
| 0.8409722222222222 | 0 |
| 0.8416666666666667 | 0 |
| 0.842361111111111 | 0 |
| 0.8430555555555556 | 0 |
| 0.84375 | 0 |
| 0.8444444444444444 | 0 |
| 0.845138888888889 | 0 |
| 0.8458333333333333 | 0 |
| 0.8465277777777778 | 0 |
| 0.8472222222222222 | 0 |
| 0.8479166666666668 | 0 |
| 0.8486111111111111 | 0 |
| 0.8493055555555555 | 0 |
| 0.85 | 0 |
| 0.8506944444444445 | 0 |
| 0.8513888888888889 | 0 |
| 0.8520833333333333 | 0 |
| 0.8527777777777777 | 0 |
| 0.8534722222222223 | 0 |
| 0.8541666666666666 | 0 |
| 0.8548611111111111 | 0 |
| 0.8555555555555556 | 0 |
| 0.8562500000000001 | 0 |
| 0.8569444444444444 | 0 |
| 0.8576388888888888 | 0 |
| 0.8583333333333334 | 0 |
| 0.8590277777777778 | 0 |
| 0.8597222222222222 | 0 |
| 0.8604166666666666 | 0 |
| 0.8611111111111112 | 0 |
| 0.8618055555555556 | 0 |
| 0.8624999999999999 | 0 |
| 0.8631944444444444 | 0 |
| 0.8638888888888889 | 0 |
| 0.8645833333333334 | 0 |
| 0.8652777777777777 | 0 |
| 0.8659722222222223 | 0 |
| 0.8666666666666667 | 0 |
| 0.8673611111111111 | 0 |
| 0.8680555555555555 | 0 |
| 0.86875 | 0 |
| 0.8694444444444445 | 0 |
| 0.8701388888888889 | 0 |
| 0.8708333333333332 | 0 |
| 0.8715277777777778 | 0 |
| 0.8722222222222222 | 0 |
| 0.8729166666666667 | 0 |
| 0.873611111111111 | 0 |
| 0.8743055555555556 | 0 |
| 0.875 | 0 |
| 0.8756944444444444 | 0 |
| 0.876388888888889 | 0 |
| 0.8770833333333333 | 0 |
| 0.8777777777777778 | 0 |
| 0.8784722222222222 | 0 |
| 0.8791666666666668 | 0 |
| 0.8798611111111111 | 0 |
| 0.8805555555555555 | 0 |
| 0.88125 | 0 |
| 0.8819444444444445 | 0 |
| 0.8826388888888889 | 0 |
| 0.8833333333333333 | 0 |
| 0.8840277777777777 | 0 |
| 0.8847222222222223 | 0 |
| 0.8854166666666666 | 0 |
| 0.8861111111111111 | 0 |
| 0.8868055555555556 | 0 |
| 0.8875000000000001 | 0 |
| 0.8881944444444444 | 0 |
| 0.8888888888888888 | 0 |
| 0.8895833333333334 | 0 |
| 0.8902777777777778 | 0 |
| 0.8909722222222222 | 0 |
| 0.8916666666666666 | 0 |
| 0.8923611111111112 | 0 |
| 0.8930555555555556 | 0 |
| 0.8937499999999999 | 0 |
| 0.8944444444444444 | 0 |
| 0.8951388888888889 | 0 |
| 0.8958333333333334 | 0 |
| 0.8965277777777777 | 0 |
| 0.8972222222222223 | 0 |
| 0.8979166666666667 | 0 |
| 0.8986111111111111 | 0 |
| 0.8993055555555555 | 0 |
| 0.9 | 0 |
| 0.9006944444444445 | 0 |
| 0.9013888888888889 | 0 |
| 0.9020833333333332 | 0 |
| 0.9027777777777778 | 0 |
| 0.9034722222222222 | 0 |
| 0.9041666666666667 | 0 |
| 0.904861111111111 | 0 |
| 0.9055555555555556 | 0 |
| 0.90625 | 0 |
| 0.9069444444444444 | 0 |
| 0.907638888888889 | 0 |
| 0.9083333333333333 | 0 |
| 0.9090277777777778 | 0 |
| 0.9097222222222222 | 0 |
| 0.9104166666666668 | 0 |
| 0.9111111111111111 | 0 |
| 0.9118055555555555 | 0 |
| 0.9125 | 0 |
| 0.9131944444444445 | 0 |
| 0.9138888888888889 | 0 |
| 0.9145833333333333 | 0 |
| 0.9152777777777777 | 0 |
| 0.9159722222222223 | 0 |
| 0.9166666666666666 | 0 |
| 0.9173611111111111 | 0 |
| 0.9180555555555556 | 0 |
| 0.9187500000000001 | 0 |
| 0.9194444444444444 | 0 |
| 0.9201388888888888 | 0 |
| 0.9208333333333334 | 0 |
| 0.9215277777777778 | 0 |
| 0.9222222222222222 | 0 |
| 0.9229166666666666 | 0 |
| 0.9236111111111112 | 0 |
| 0.9243055555555556 | 0 |
| 0.9249999999999999 | 0 |
| 0.9256944444444444 | 0 |
| 0.9263888888888889 | 0 |
| 0.9270833333333334 | 0 |
| 0.9277777777777777 | 0 |
| 0.9284722222222223 | 0 |
| 0.9291666666666667 | 0 |
| 0.9298611111111111 | 0 |
| 0.9305555555555555 | 0 |
| 0.93125 | 0 |
| 0.9319444444444445 | 0 |
| 0.9326388888888889 | 0 |
| 0.9333333333333332 | 0 |
| 0.9340277777777778 | 0 |
| 0.9347222222222222 | 0 |
| 0.9354166666666667 | 0 |
| 0.936111111111111 | 0 |
| 0.9368055555555556 | 0 |
| 0.9375 | 0 |
| 0.9381944444444444 | 0 |
| 0.938888888888889 | 0 |
| 0.9395833333333333 | 0 |
| 0.9402777777777778 | 0 |
| 0.9409722222222222 | 0 |
| 0.9416666666666668 | 0 |
| 0.9423611111111111 | 0 |
| 0.9430555555555555 | 0 |
| 0.94375 | 0 |
| 0.9444444444444445 | 0 |
| 0.9451388888888889 | 0 |
| 0.9458333333333333 | 0 |
| 0.9465277777777777 | 0 |
| 0.9472222222222223 | 0 |
| 0.9479166666666666 | 0 |
| 0.9486111111111111 | 0 |
| 0.9493055555555556 | 0 |
| 0.9500000000000001 | 0 |
| 0.9506944444444444 | 0 |
| 0.9513888888888888 | 0 |
| 0.9520833333333334 | 0 |
| 0.9527777777777778 | 0 |
| 0.9534722222222222 | 0 |
| 0.9541666666666666 | 0 |
| 0.9548611111111112 | 0 |
| 0.9555555555555556 | 0 |
| 0.9562499999999999 | 0 |
| 0.9569444444444444 | 0 |
| 0.9576388888888889 | 0 |
| 0.9583333333333334 | 0 |
| 0.9590277777777777 | 0 |
| 0.9597222222222223 | 0 |
| 0.9604166666666667 | 0 |
| 0.9611111111111111 | 0 |
| 0.9618055555555555 | 0 |
| 0.9625 | 0 |
| 0.9631944444444445 | 0 |
| 0.9638888888888889 | 0 |
| 0.9645833333333332 | 0 |
| 0.9652777777777778 | 0 |
| 0.9659722222222222 | 0 |
| 0.9666666666666667 | 0 |
| 0.967361111111111 | 0 |
| 0.9680555555555556 | 0 |
| 0.96875 | 0 |
| 0.9694444444444444 | 0 |
| 0.970138888888889 | 0 |
| 0.9708333333333333 | 0 |
| 0.9715277777777778 | 0 |
| 0.9722222222222222 | 0 |
| 0.9729166666666668 | 0 |
| 0.9736111111111111 | 0 |
| 0.9743055555555555 | 0 |
| 0.975 | 0 |
| 0.9756944444444445 | 0 |
| 0.9763888888888889 | 0 |
| 0.9770833333333333 | 0 |
| 0.9777777777777777 | 0 |
| 0.9784722222222223 | 0 |
| 0.9791666666666666 | 0 |
| 0.9798611111111111 | 0 |
| 0.9805555555555556 | 0 |
| 0.9812500000000001 | 0 |
| 0.9819444444444444 | 0 |
| 0.9826388888888888 | 0 |
| 0.9833333333333334 | 0 |
| 0.9840277777777778 | 0 |
| 0.9847222222222222 | 0 |
| 0.9854166666666666 | 0 |
| 0.9861111111111112 | 0 |
| 0.9868055555555556 | 0 |
| 0.9874999999999999 | 0 |
| 0.9881944444444444 | 0 |
| 0.9888888888888889 | 0 |
| 0.9895833333333334 | 0 |
| 0.9902777777777777 | 0 |
| 0.9909722222222223 | 0 |
| 0.9916666666666667 | 0 |
| 0.9923611111111111 | 0 |
| 0.9930555555555555 | 0 |
| 0.99375 | 0 |
| 0.9944444444444445 | 0 |
| 0.9951388888888889 | 0 |
| 0.9958333333333332 | 0 |
| 0.9965277777777778 | 0 |
| 0.9972222222222222 | 0 |
| 0.9979166666666667 | 0 |
| 0.998611111111111 | 0 |
| 0.9993055555555556 | 0 |